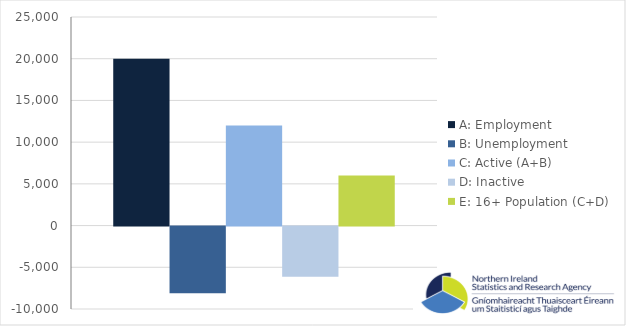
| Category | A: Employment | B: Unemployment | C: Active (A+B) | D: Inactive | E: 16+ Population (C+D) |
|---|---|---|---|---|---|
| 0 | 20000 | -8000 | 12000 | -6000 | 6000 |